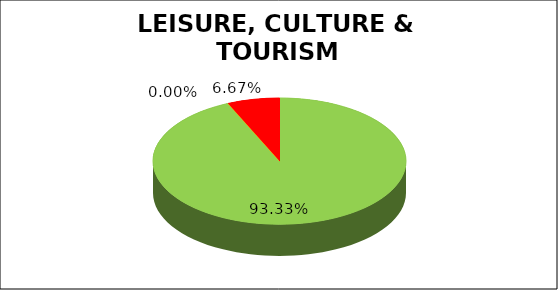
| Category | Q2 |
|---|---|
| Green | 0.933 |
| Amber | 0 |
| Red | 0.067 |